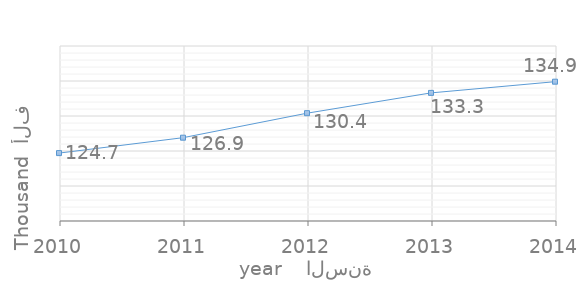
| Category | القيمة
Value |
|---|---|
| 2014.0 | 134.9 |
| 2013.0 | 133.3 |
| 2012.0 | 130.4 |
| 2011.0 | 126.9 |
| 2010.0 | 124.7 |